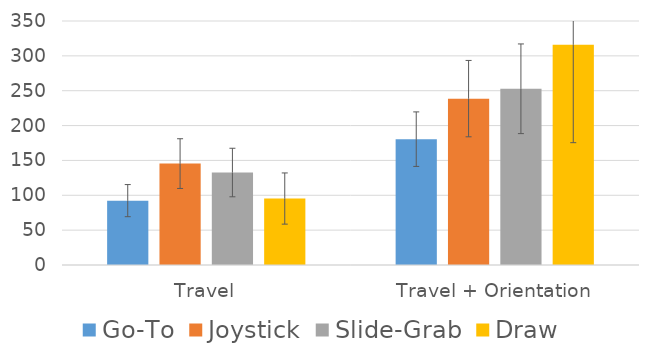
| Category | Go-To | Joystick | Slide-Grab | Draw |
|---|---|---|---|---|
| Travel | 92.33 | 145.455 | 132.642 | 95.329 |
| Travel + Orientation | 180.522 | 238.651 | 252.782 | 315.945 |